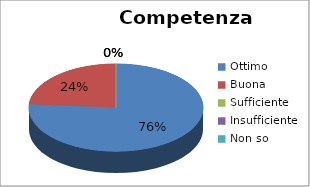
| Category | Competenza prelevatore |
|---|---|
| Ottimo | 16 |
| Buona | 5 |
| Sufficiente | 0 |
| Insufficiente | 0 |
| Non so | 0 |